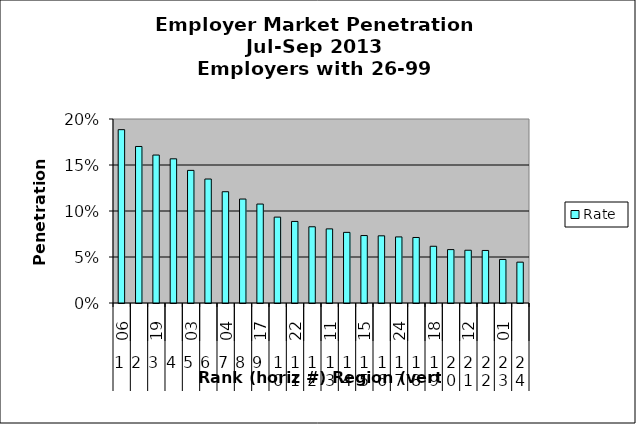
| Category | Rate |
|---|---|
| 0 | 0.188 |
| 1 | 0.17 |
| 2 | 0.161 |
| 3 | 0.157 |
| 4 | 0.144 |
| 5 | 0.135 |
| 6 | 0.121 |
| 7 | 0.113 |
| 8 | 0.108 |
| 9 | 0.093 |
| 10 | 0.089 |
| 11 | 0.083 |
| 12 | 0.081 |
| 13 | 0.077 |
| 14 | 0.073 |
| 15 | 0.073 |
| 16 | 0.072 |
| 17 | 0.071 |
| 18 | 0.062 |
| 19 | 0.058 |
| 20 | 0.057 |
| 21 | 0.057 |
| 22 | 0.047 |
| 23 | 0.044 |